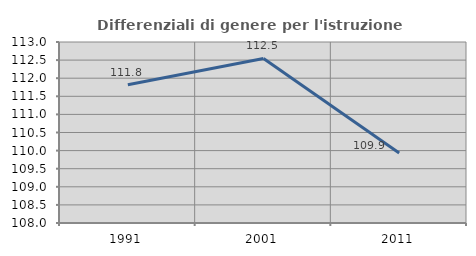
| Category | Differenziali di genere per l'istruzione superiore |
|---|---|
| 1991.0 | 111.821 |
| 2001.0 | 112.546 |
| 2011.0 | 109.934 |